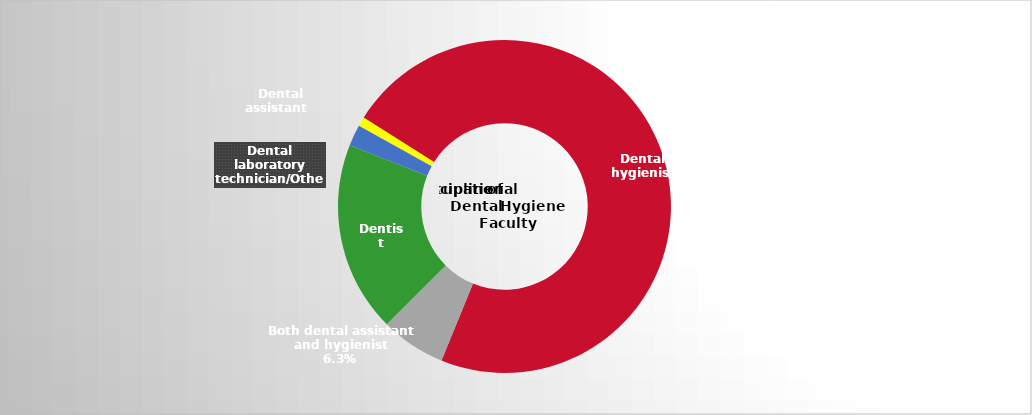
| Category | Series 2 |
|---|---|
| Dental assistant   | 0.009 |
| Dental hygienist | 0.722 |
| Both dental assistant and hygienist | 0.063 |
| Dentist | 0.185 |
| Dental laboratory technician/Other | 0.021 |